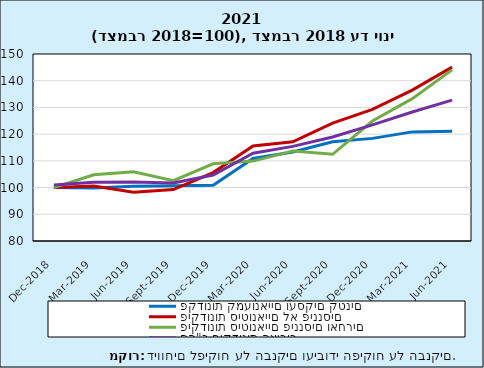
| Category | פקדונות קמעונאיים ועסקים קטנים | פיקדונות סיטונאיים לא פיננסים | פיקדונות סיטונאיים פיננסים ואחרים | סה"כ פיקדונות הציבור |
|---|---|---|---|---|
| 2018-12-31 | 100 | 100 | 100 | 101 |
| 2019-03-31 | 99.809 | 100.586 | 104.764 | 102.035 |
| 2019-06-30 | 100.47 | 98.225 | 105.908 | 102.105 |
| 2019-09-30 | 100.674 | 99.244 | 102.566 | 101.749 |
| 2019-12-31 | 100.906 | 105.602 | 108.891 | 104.692 |
| 2020-03-31 | 110.907 | 115.563 | 109.91 | 112.884 |
| 2020-06-30 | 113.325 | 117.121 | 113.7 | 115.417 |
| 2020-09-30 | 117.127 | 124.164 | 112.448 | 118.939 |
| 2020-12-31 | 118.414 | 129.27 | 124.906 | 123.487 |
| 2021-03-31 | 120.847 | 136.47 | 133.292 | 128.308 |
| 2021-06-30 | 121.128 | 145.103 | 144.069 | 132.747 |